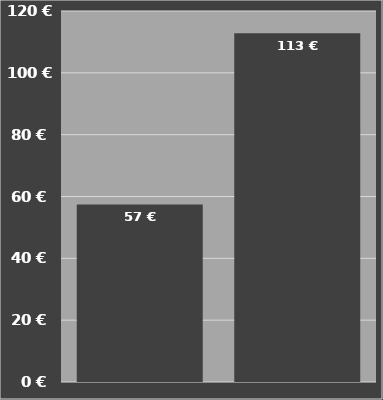
| Category | Kosten je Stunde |
|---|---|
| Supercis 500 mit Condor Schleppschuhverteiler | 57.415 |